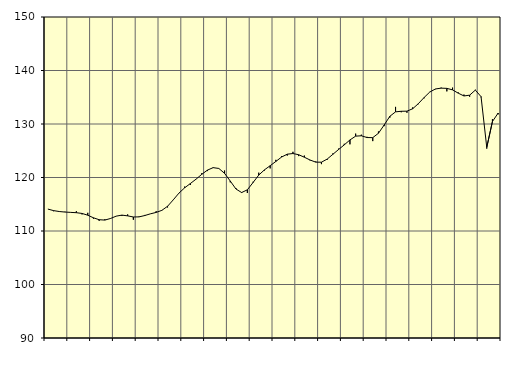
| Category | Piggar | Samtliga anställda (inkl. anställda utomlands) |
|---|---|---|
| nan | 114.1 | 114.1 |
| 1.0 | 113.7 | 113.81 |
| 1.0 | 113.6 | 113.64 |
| 1.0 | 113.6 | 113.54 |
| nan | 113.5 | 113.48 |
| 2.0 | 113.7 | 113.42 |
| 2.0 | 113.1 | 113.28 |
| 2.0 | 113.4 | 112.95 |
| nan | 112.3 | 112.47 |
| 3.0 | 111.9 | 112.11 |
| 3.0 | 112.2 | 112.04 |
| 3.0 | 112.3 | 112.34 |
| nan | 112.8 | 112.78 |
| 4.0 | 112.8 | 112.97 |
| 4.0 | 113.1 | 112.83 |
| 4.0 | 112.1 | 112.62 |
| nan | 112.7 | 112.64 |
| 5.0 | 113 | 112.89 |
| 5.0 | 113.2 | 113.21 |
| 5.0 | 113.7 | 113.47 |
| nan | 113.9 | 113.86 |
| 6.0 | 114.4 | 114.62 |
| 6.0 | 115.8 | 115.82 |
| 6.0 | 117.1 | 117.08 |
| nan | 118.3 | 118.07 |
| 7.0 | 118.6 | 118.87 |
| 7.0 | 119.7 | 119.69 |
| 7.0 | 120.8 | 120.59 |
| nan | 121.2 | 121.38 |
| 8.0 | 121.9 | 121.84 |
| 8.0 | 121.7 | 121.69 |
| 8.0 | 121.3 | 120.78 |
| nan | 119.1 | 119.34 |
| 9.0 | 118 | 117.85 |
| 9.0 | 117.1 | 117.19 |
| 9.0 | 117.1 | 117.7 |
| nan | 119.2 | 119.06 |
| 10.0 | 120.9 | 120.45 |
| 10.0 | 121.3 | 121.43 |
| 10.0 | 121.7 | 122.2 |
| nan | 123.3 | 123 |
| 11.0 | 124 | 123.82 |
| 11.0 | 124.1 | 124.36 |
| 11.0 | 124.8 | 124.48 |
| nan | 124 | 124.26 |
| 12.0 | 124.1 | 123.79 |
| 12.0 | 123.2 | 123.27 |
| 12.0 | 123 | 122.87 |
| nan | 122.5 | 122.86 |
| 13.0 | 123.3 | 123.44 |
| 13.0 | 124.5 | 124.33 |
| 13.0 | 125.4 | 125.23 |
| nan | 126.3 | 126.1 |
| 14.0 | 126.2 | 127.02 |
| 14.0 | 128.2 | 127.73 |
| 14.0 | 128 | 127.8 |
| nan | 127.6 | 127.47 |
| 15.0 | 126.8 | 127.45 |
| 15.0 | 128.6 | 128.27 |
| 15.0 | 129.6 | 129.81 |
| nan | 131.2 | 131.44 |
| 16.0 | 133.2 | 132.27 |
| 16.0 | 132.2 | 132.38 |
| 16.0 | 132.1 | 132.4 |
| nan | 133.1 | 132.85 |
| 17.0 | 133.7 | 133.8 |
| 17.0 | 134.8 | 134.94 |
| 17.0 | 136 | 135.97 |
| nan | 136.5 | 136.55 |
| 18.0 | 136.8 | 136.7 |
| 18.0 | 136.1 | 136.66 |
| 18.0 | 136.8 | 136.38 |
| nan | 135.9 | 135.76 |
| 19.0 | 135.5 | 135.24 |
| 19.0 | 135.1 | 135.39 |
| 19.0 | 136.4 | 136.34 |
| nan | 135 | 135.11 |
| 20.0 | 125.4 | 125.64 |
| 20.0 | 130.9 | 130.46 |
| 20.0 | 131.8 | 132.05 |